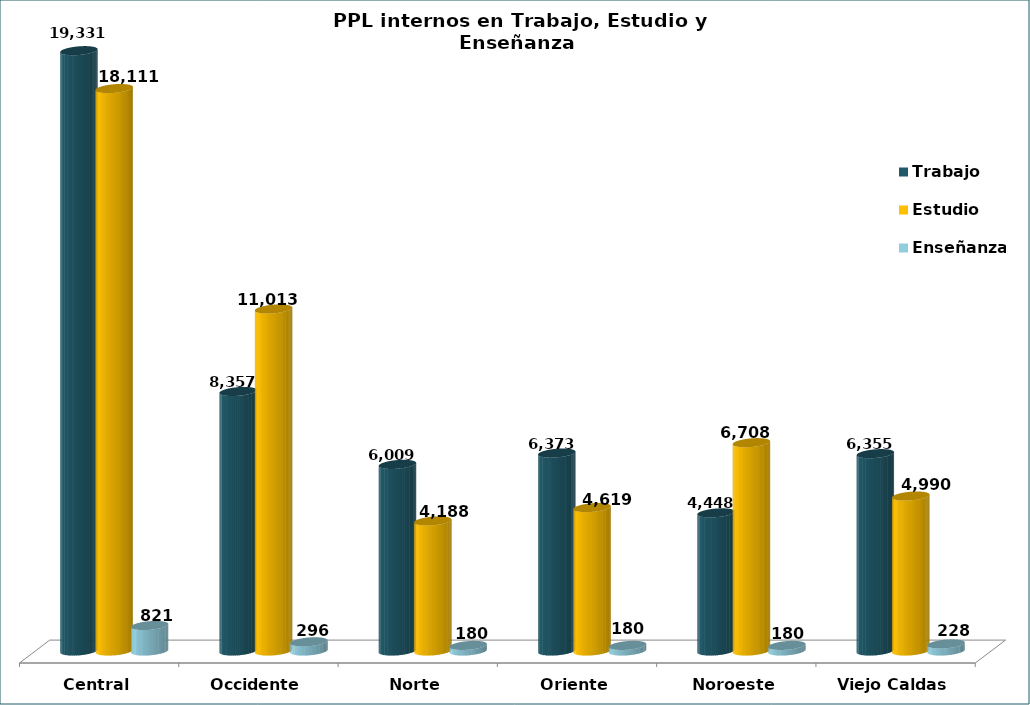
| Category | Trabajo | Estudio | Enseñanza |
|---|---|---|---|
| Central | 19331 | 18111 | 821 |
| Occidente | 8357 | 11013 | 296 |
| Norte | 6009 | 4188 | 180 |
| Oriente | 6373 | 4619 | 180 |
| Noroeste | 4448 | 6708 | 180 |
| Viejo Caldas | 6355 | 4990 | 228 |